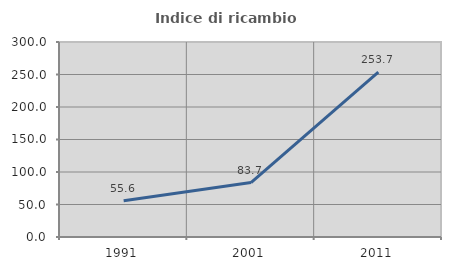
| Category | Indice di ricambio occupazionale  |
|---|---|
| 1991.0 | 55.61 |
| 2001.0 | 83.721 |
| 2011.0 | 253.704 |